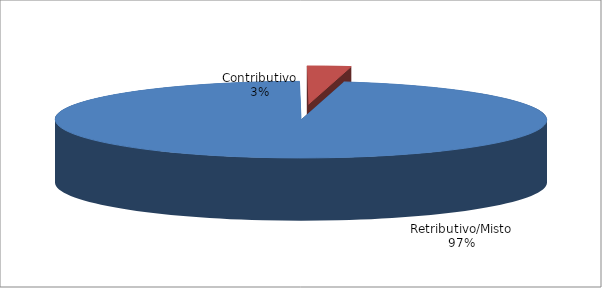
| Category | Series 1 |
|---|---|
| Retributivo/Misto | 53616 |
| Contributivo | 1589 |